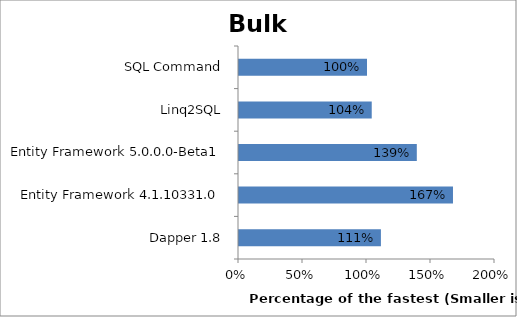
| Category | Series 0 |
|---|---|
| Dapper 1.8 | 1.109 |
| Entity Framework 4.1.10331.0 | 1.672 |
| Entity Framework 5.0.0.0-Beta1 | 1.389 |
| Linq2SQL | 1.037 |
| SQL Command | 1 |